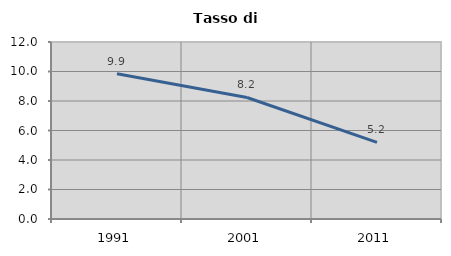
| Category | Tasso di disoccupazione   |
|---|---|
| 1991.0 | 9.85 |
| 2001.0 | 8.238 |
| 2011.0 | 5.198 |